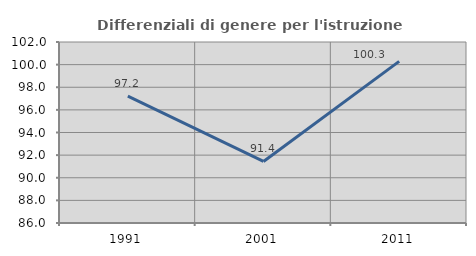
| Category | Differenziali di genere per l'istruzione superiore |
|---|---|
| 1991.0 | 97.219 |
| 2001.0 | 91.441 |
| 2011.0 | 100.289 |